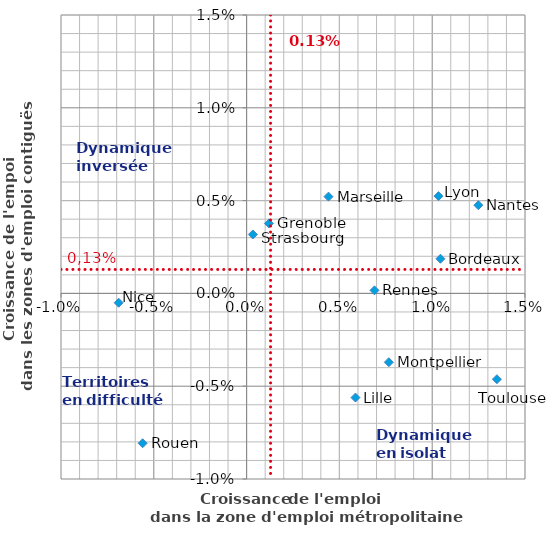
| Category | ZE contiguës intrarégionales |
|---|---|
| 0.010338123262699339 | 0.005 |
| 0.00441337419315091 | 0.005 |
| 0.012486221599508296 | 0.005 |
| 0.0012007358049570538 | 0.004 |
| 0.00033676772804613897 | 0.003 |
| 0.01044392860888399 | 0.002 |
| 0.006890026029029661 | 0 |
| -0.006893199132640304 | -0.001 |
| 0.007663196678477258 | -0.004 |
| 0.01348617470958402 | -0.005 |
| 0.005865775480508262 | -0.006 |
| -0.005601268649999658 | -0.008 |